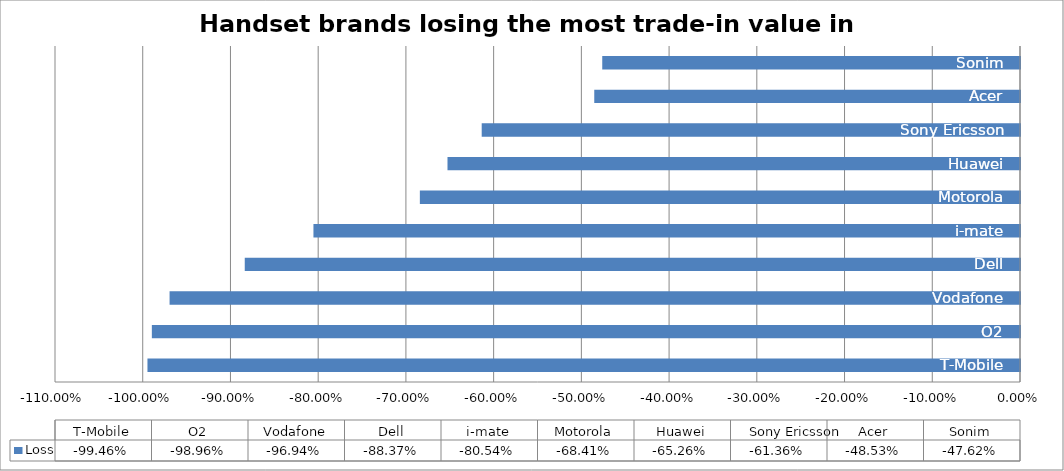
| Category | Loss |
|---|---|
| T-Mobile | -0.995 |
| O2 | -0.99 |
| Vodafone | -0.969 |
| Dell | -0.884 |
| i-mate | -0.805 |
| Motorola | -0.684 |
| Huawei | -0.653 |
| Sony Ericsson | -0.614 |
| Acer | -0.485 |
| Sonim | -0.476 |